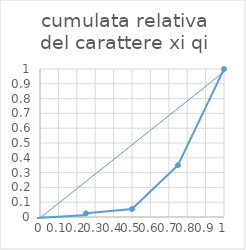
| Category | cumulata relativa del carattere xi qi |
|---|---|
| 0.25 | 0.025 |
| 0.5 | 0.054 |
| 0.75 | 0.35 |
| 1.0 | 1 |